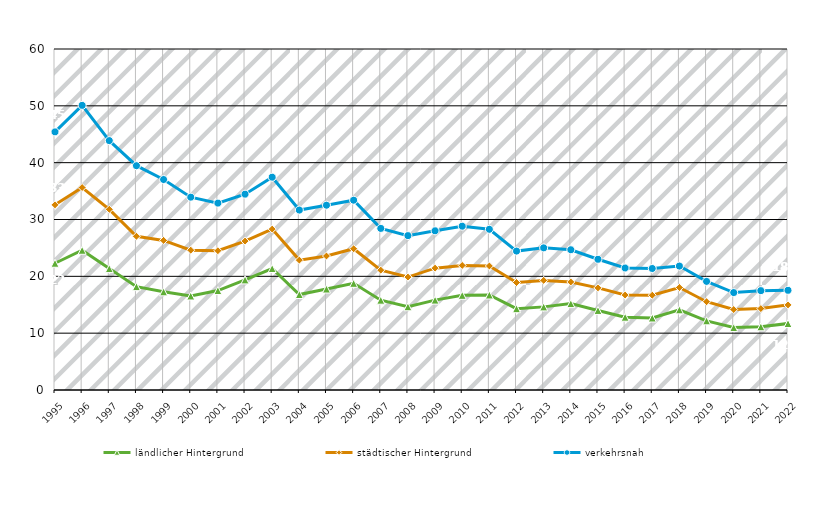
| Category | ländlicher Hintergrund | städtischer Hintergrund | verkehrsnah |
|---|---|---|---|
| 1995.0 | 22.303 | 32.576 | 45.415 |
| 1996.0 | 24.586 | 35.626 | 50.083 |
| 1997.0 | 21.362 | 31.786 | 43.88 |
| 1998.0 | 18.188 | 27.049 | 39.467 |
| 1999.0 | 17.271 | 26.322 | 37.034 |
| 2000.0 | 16.545 | 24.599 | 33.929 |
| 2001.0 | 17.498 | 24.508 | 32.884 |
| 2002.0 | 19.374 | 26.201 | 34.457 |
| 2003.0 | 21.377 | 28.315 | 37.444 |
| 2004.0 | 16.801 | 22.855 | 31.659 |
| 2005.0 | 17.768 | 23.577 | 32.515 |
| 2006.0 | 18.769 | 24.853 | 33.395 |
| 2007.0 | 15.803 | 21.089 | 28.432 |
| 2008.0 | 14.647 | 19.872 | 27.161 |
| 2009.0 | 15.818 | 21.439 | 28.011 |
| 2010.0 | 16.657 | 21.916 | 28.826 |
| 2011.0 | 16.716 | 21.821 | 28.274 |
| 2012.0 | 14.303 | 18.911 | 24.445 |
| 2013.0 | 14.626 | 19.288 | 25.009 |
| 2014.0 | 15.203 | 19.006 | 24.675 |
| 2015.0 | 13.997 | 17.973 | 22.999 |
| 2016.0 | 12.807 | 16.708 | 21.466 |
| 2017.0 | 12.667 | 16.673 | 21.377 |
| 2018.0 | 14.102 | 18.033 | 21.807 |
| 2019.0 | 12.169 | 15.535 | 19.11 |
| 2020.0 | 10.991 | 14.158 | 17.14 |
| 2021.0 | 11.122 | 14.322 | 17.48 |
| 2022.0 | 11.701 | 14.972 | 17.541 |